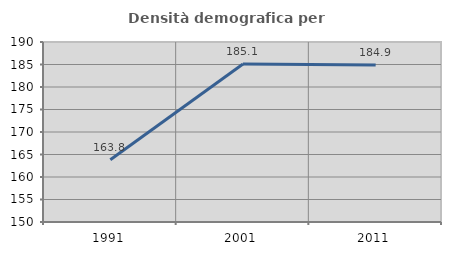
| Category | Densità demografica |
|---|---|
| 1991.0 | 163.828 |
| 2001.0 | 185.13 |
| 2011.0 | 184.888 |